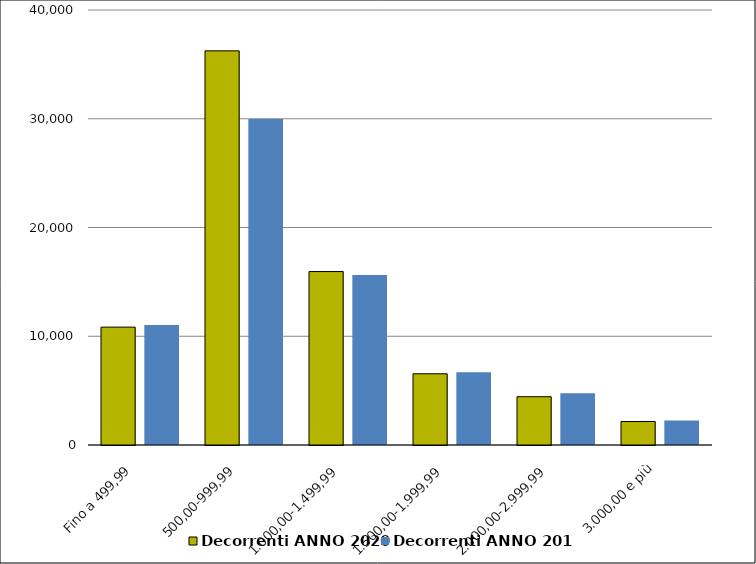
| Category | Decorrenti ANNO 2020 | Decorrenti ANNO 2019 |
|---|---|---|
| Fino a 499,99 | 10838 | 11031 |
| 500,00-999,99 | 36244 | 29975 |
| 1.000,00-1.499,99 | 15949 | 15639 |
| 1.500,00-1.999,99 | 6549 | 6679 |
| 2.000,00-2.999,99 | 4440 | 4763 |
| 3.000,00 e più | 2161 | 2261 |